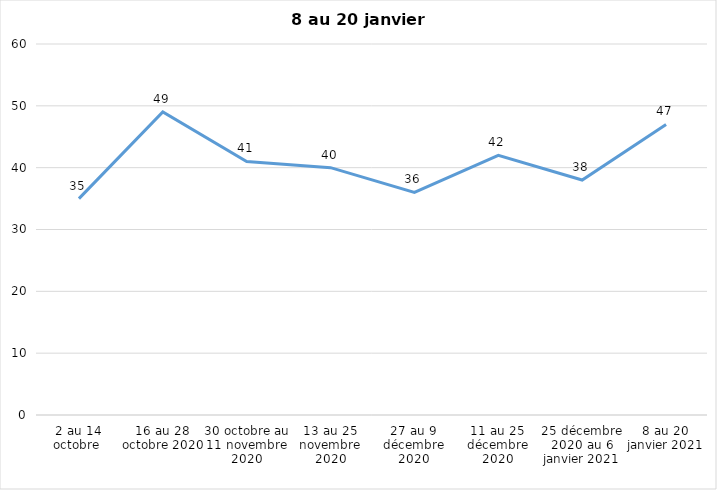
| Category | Toujours aux trois mesures |
|---|---|
| 2 au 14 octobre  | 35 |
| 16 au 28 octobre 2020 | 49 |
| 30 octobre au 11 novembre 2020 | 41 |
| 13 au 25 novembre 2020 | 40 |
| 27 au 9 décembre 2020 | 36 |
| 11 au 25 décembre 2020 | 42 |
| 25 décembre 2020 au 6 janvier 2021 | 38 |
| 8 au 20 janvier 2021 | 47 |